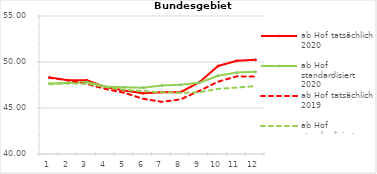
| Category | ab Hof tatsächlich 2020 | ab Hof standardisiert 2020 | ab Hof tatsächlich 2019 | ab Hof standardisiert 2019 |
|---|---|---|---|---|
| 0 | 48.329 | 47.672 | 48.283 | 47.579 |
| 1 | 48.013 | 47.73 | 48.012 | 47.676 |
| 2 | 48.029 | 47.825 | 47.614 | 47.655 |
| 3 | 47.272 | 47.327 | 47.065 | 47.281 |
| 4 | 46.914 | 47.251 | 46.649 | 46.975 |
| 5 | 46.604 | 47.209 | 45.999 | 46.829 |
| 6 | 46.702 | 47.452 | 45.674 | 46.699 |
| 7 | 46.721 | 47.523 | 45.933 | 46.646 |
| 8 | 47.81 | 47.745 | 46.867 | 46.717 |
| 9 | 49.574 | 48.511 | 47.862 | 47.078 |
| 10 | 50.129 | 48.852 | 48.444 | 47.222 |
| 11 | 50.241 | 48.929 | 48.416 | 47.379 |